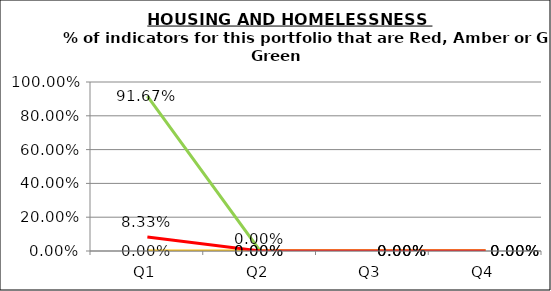
| Category | Green | Amber | Red |
|---|---|---|---|
| Q1 | 0.917 | 0 | 0.083 |
| Q2 | 0 | 0 | 0 |
| Q3 | 0 | 0 | 0 |
| Q4 | 0 | 0 | 0 |